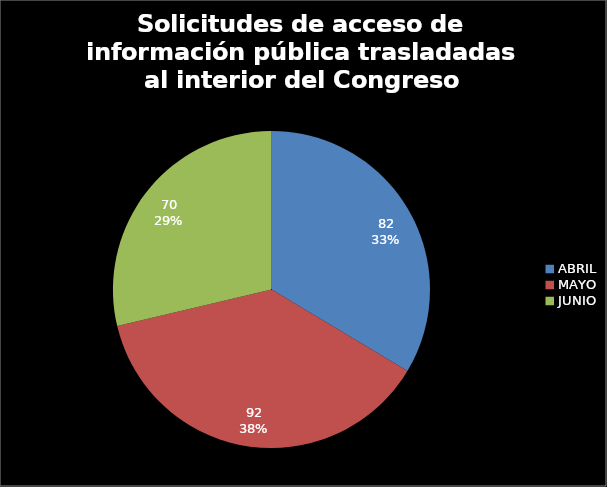
| Category | Solicitudes de acceso de información pública trasladadas al interior del Congreso |
|---|---|
| ABRIL | 82 |
| MAYO | 92 |
| JUNIO | 70 |